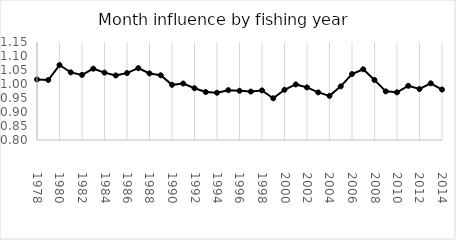
| Category | Series 0 |
|---|---|
| 1978.0 | 1.016 |
| 1979.0 | 1.014 |
| 1980.0 | 1.068 |
| 1981.0 | 1.041 |
| 1982.0 | 1.032 |
| 1983.0 | 1.055 |
| 1984.0 | 1.041 |
| 1985.0 | 1.031 |
| 1986.0 | 1.039 |
| 1987.0 | 1.057 |
| 1988.0 | 1.038 |
| 1989.0 | 1.031 |
| 1990.0 | 0.997 |
| 1991.0 | 1.002 |
| 1992.0 | 0.985 |
| 1993.0 | 0.971 |
| 1994.0 | 0.969 |
| 1995.0 | 0.978 |
| 1996.0 | 0.976 |
| 1997.0 | 0.973 |
| 1998.0 | 0.977 |
| 1999.0 | 0.949 |
| 2000.0 | 0.979 |
| 2001.0 | 0.998 |
| 2002.0 | 0.988 |
| 2003.0 | 0.97 |
| 2004.0 | 0.958 |
| 2005.0 | 0.992 |
| 2006.0 | 1.035 |
| 2007.0 | 1.053 |
| 2008.0 | 1.014 |
| 2009.0 | 0.974 |
| 2010.0 | 0.97 |
| 2011.0 | 0.993 |
| 2012.0 | 0.982 |
| 2013.0 | 1.002 |
| 2014.0 | 0.98 |